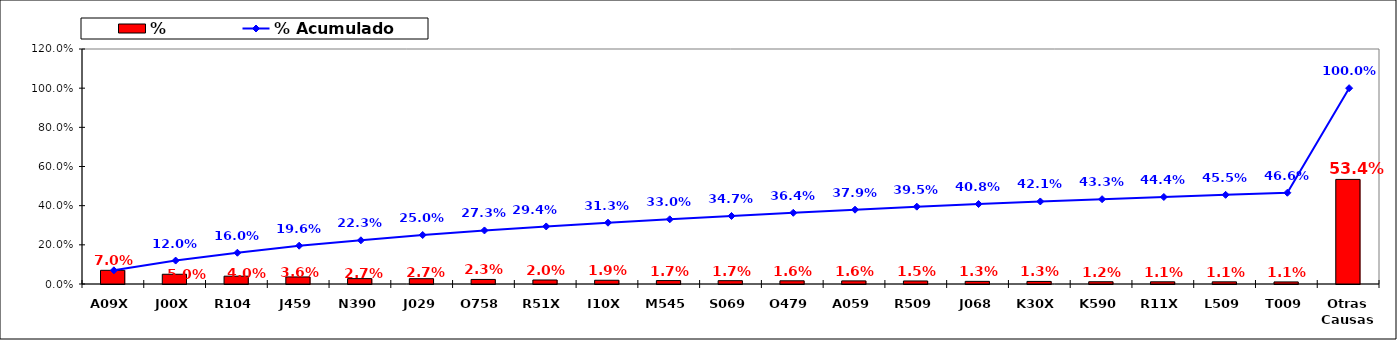
| Category | % |
|---|---|
| A09X | 0.07 |
| J00X | 0.05 |
| R104 | 0.04 |
| J459 | 0.036 |
| N390 | 0.027 |
| J029 | 0.027 |
| O758 | 0.023 |
| R51X | 0.02 |
| I10X | 0.019 |
| M545 | 0.017 |
| S069 | 0.017 |
| O479 | 0.016 |
| A059 | 0.016 |
| R509 | 0.015 |
| J068 | 0.013 |
| K30X | 0.013 |
| K590 | 0.012 |
| R11X | 0.011 |
| L509 | 0.011 |
| T009 | 0.011 |
| Otras Causas | 0.534 |